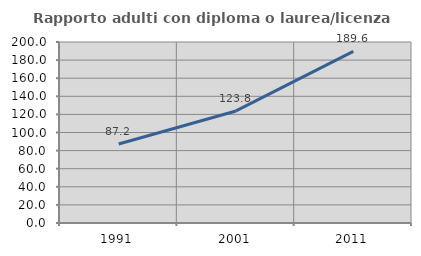
| Category | Rapporto adulti con diploma o laurea/licenza media  |
|---|---|
| 1991.0 | 87.217 |
| 2001.0 | 123.818 |
| 2011.0 | 189.592 |